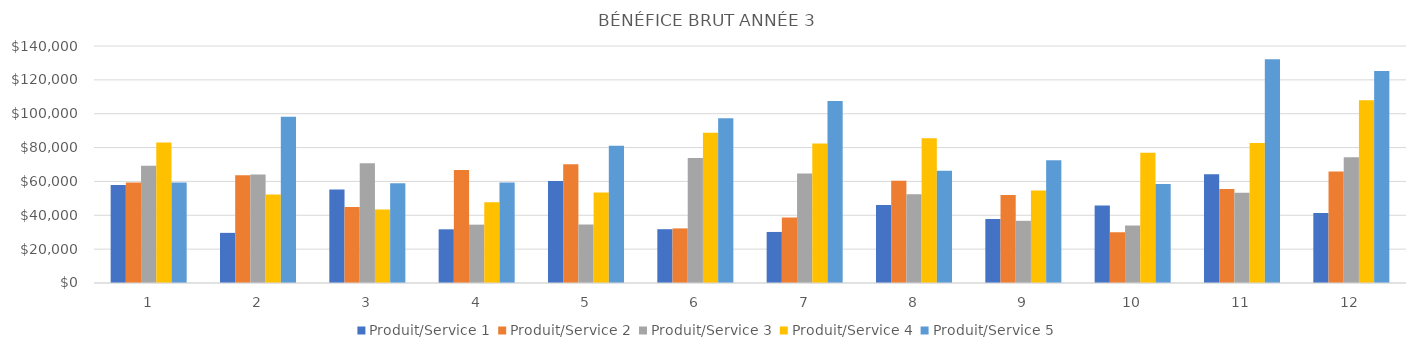
| Category | Produit/Service 1 | Produit/Service 2 | Produit/Service 3 | Produit/Service 4 | Produit/Service 5 |
|---|---|---|---|---|---|
| 0 | 57836.6 | 59440 | 69246 | 82984 | 59413.5 |
| 1 | 29614.1 | 63648 | 64143 | 52347.6 | 98185.5 |
| 2 | 55166.4 | 44895 | 70812 | 43367.7 | 58932.5 |
| 3 | 31708.8 | 66690.6 | 34479 | 47752.2 | 59427.5 |
| 4 | 60206.4 | 70077.2 | 34560 | 53457.6 | 81075 |
| 5 | 31779.6 | 32250.6 | 73809 | 88777.8 | 97290 |
| 6 | 30153.7 | 38663 | 64629 | 82350.9 | 107459.5 |
| 7 | 46071.9 | 60368.4 | 52452 | 85547.7 | 66308.5 |
| 8 | 37793.3 | 52053.6 | 36738 | 54600.9 | 72485.5 |
| 9 | 45727.2 | 29979.2 | 33957 | 76889.7 | 58522 |
| 10 | 64291.5 | 55457.4 | 53364 | 82752.7 | 132151.5 |
| 11 | 41314 | 65830.8 | 74340 | 108009.5 | 125209.5 |